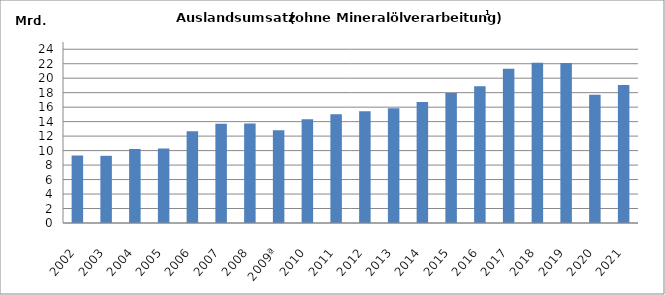
| Category | Series 0 |
|---|---|
| 2002  | 9333876.194 |
| 2003 | 9280061.294 |
| 2004 | 10227412.62 |
| 2005 | 10298460.421 |
| 2006  | 12658471.838 |
| 2007 | 13722597.678 |
| 2008  | 13747366.687 |
| 2009ª | 12808832.69 |
| 2010  | 14321679.718 |
| 2011 | 15018937.533 |
| 2012  | 15435287.933 |
| 2013  | 15854090.158 |
| 2014  | 16718170.123 |
| 2015  | 17944142.383 |
| 2016  | 18894048.431 |
| 2017  | 21311172.808 |
| 2018  | 22141164.77 |
| 2019  | 22114399.679 |
| 2020  | 17704809.081 |
| 2021  | 19072263.273 |